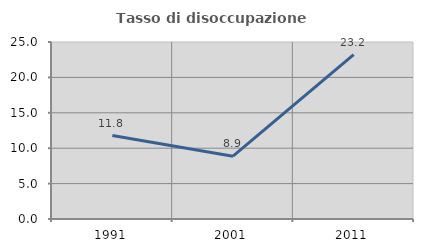
| Category | Tasso di disoccupazione giovanile  |
|---|---|
| 1991.0 | 11.793 |
| 2001.0 | 8.874 |
| 2011.0 | 23.214 |